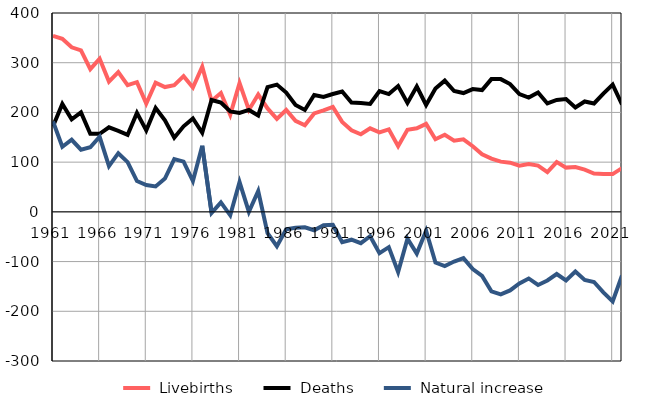
| Category |  Livebirths |  Deaths |  Natural increase |
|---|---|---|---|
| 1961.0 | 354 | 172 | 182 |
| 1962.0 | 348 | 217 | 131 |
| 1963.0 | 331 | 186 | 145 |
| 1964.0 | 325 | 200 | 125 |
| 1965.0 | 287 | 157 | 130 |
| 1966.0 | 308 | 157 | 151 |
| 1967.0 | 262 | 170 | 92 |
| 1968.0 | 281 | 163 | 118 |
| 1969.0 | 255 | 155 | 100 |
| 1970.0 | 261 | 199 | 62 |
| 1971.0 | 218 | 164 | 54 |
| 1972.0 | 260 | 209 | 51 |
| 1973.0 | 251 | 184 | 67 |
| 1974.0 | 255 | 149 | 106 |
| 1975.0 | 273 | 172 | 101 |
| 1976.0 | 250 | 188 | 62 |
| 1977.0 | 292 | 159 | 133 |
| 1978.0 | 223 | 225 | -2 |
| 1979.0 | 239 | 220 | 19 |
| 1980.0 | 195 | 202 | -7 |
| 1981.0 | 259 | 199 | 60 |
| 1982.0 | 205 | 205 | 0 |
| 1983.0 | 236 | 194 | 42 |
| 1984.0 | 208 | 251 | -43 |
| 1985.0 | 187 | 256 | -69 |
| 1986.0 | 205 | 240 | -35 |
| 1987.0 | 183 | 215 | -32 |
| 1988.0 | 174 | 205 | -31 |
| 1989.0 | 198 | 235 | -37 |
| 1990.0 | 204 | 231 | -27 |
| 1991.0 | 211 | 237 | -26 |
| 1992.0 | 181 | 242 | -61 |
| 1993.0 | 164 | 220 | -56 |
| 1994.0 | 156 | 219 | -63 |
| 1995.0 | 168 | 217 | -49 |
| 1996.0 | 160 | 243 | -83 |
| 1997.0 | 166 | 237 | -71 |
| 1998.0 | 132 | 253 | -121 |
| 1999.0 | 165 | 219 | -54 |
| 2000.0 | 168 | 252 | -84 |
| 2001.0 | 177 | 215 | -38 |
| 2002.0 | 146 | 248 | -102 |
| 2003.0 | 155 | 264 | -109 |
| 2004.0 | 143 | 243 | -100 |
| 2005.0 | 146 | 239 | -93 |
| 2006.0 | 132 | 247 | -115 |
| 2007.0 | 116 | 245 | -129 |
| 2008.0 | 107 | 267 | -160 |
| 2009.0 | 101 | 267 | -166 |
| 2010.0 | 99 | 257 | -158 |
| 2011.0 | 93 | 237 | -144 |
| 2012.0 | 96 | 230 | -134 |
| 2013.0 | 93 | 240 | -147 |
| 2014.0 | 80 | 218 | -138 |
| 2015.0 | 100 | 225 | -125 |
| 2016.0 | 89 | 227 | -138 |
| 2017.0 | 90 | 210 | -120 |
| 2018.0 | 85 | 222 | -137 |
| 2019.0 | 77 | 218 | -141 |
| 2020.0 | 76 | 238 | -162 |
| 2021.0 | 76 | 256 | -180 |
| 2022.0 | 88 | 216 | -128 |